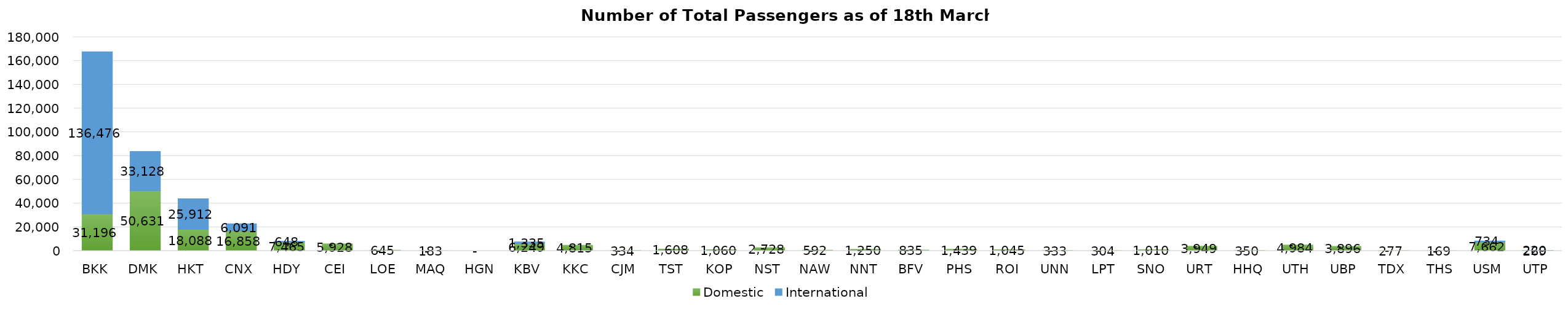
| Category | Domestic | International |
|---|---|---|
| BKK | 31196 | 136476 |
| DMK | 50631 | 33128 |
| HKT | 18088 | 25912 |
| CNX | 16858 | 6091 |
| HDY | 7465 | 648 |
| CEI | 5928 | 0 |
| LOE | 645 | 0 |
| MAQ | 183 | 0 |
| HGN | 0 | 0 |
| KBV | 6249 | 1335 |
| KKC | 4815 | 0 |
| CJM | 334 | 0 |
| TST | 1608 | 0 |
| KOP | 1060 | 0 |
| NST | 2728 | 0 |
| NAW | 592 | 0 |
| NNT | 1250 | 0 |
| BFV | 835 | 0 |
| PHS | 1439 | 0 |
| ROI | 1045 | 0 |
| UNN | 333 | 0 |
| LPT | 304 | 0 |
| SNO | 1010 | 0 |
| URT | 3949 | 0 |
| HHQ | 350 | 0 |
| UTH | 4984 | 0 |
| UBP | 3896 | 0 |
| TDX | 277 | 0 |
| THS | 169 | 0 |
| USM | 7662 | 734 |
| UTP | 269 | 220 |